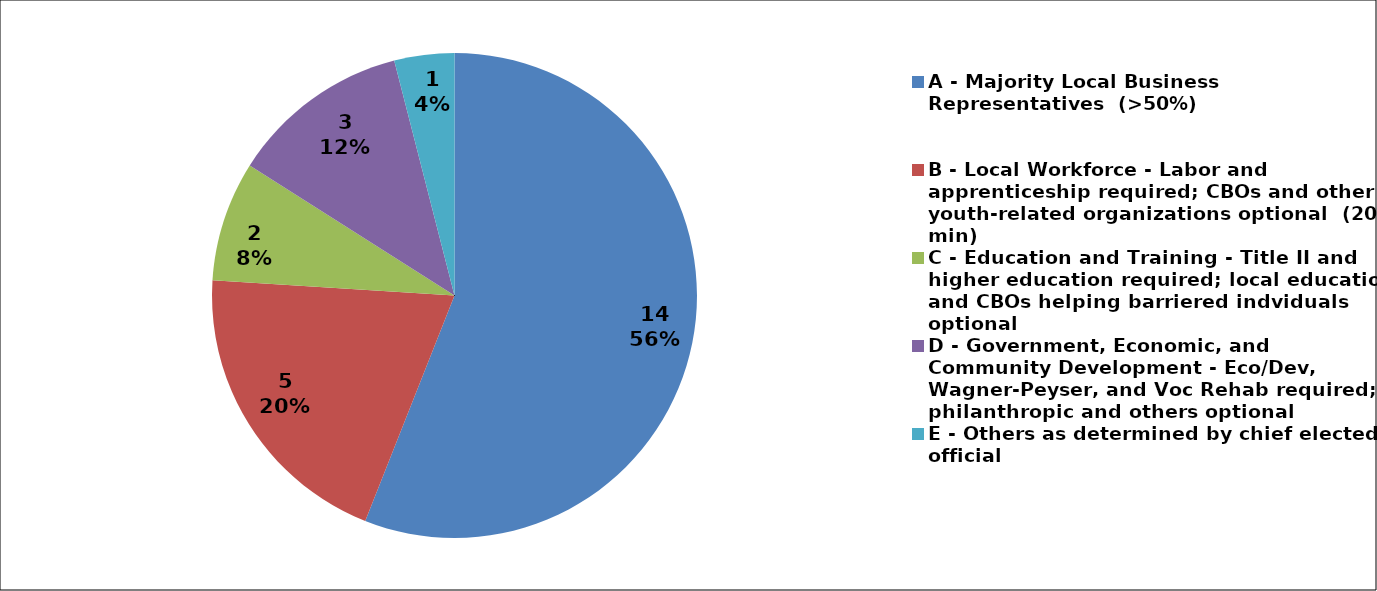
| Category | Series 0 |
|---|---|
| A - Majority Local Business Representatives  (>50%) | 14 |
| B - Local Workforce - Labor and apprenticeship required; CBOs and other youth-related organizations optional  (20% min) | 5 |
| C - Education and Training - Title II and higher education required; local education and CBOs helping barriered indviduals optional | 2 |
| D - Government, Economic, and Community Development - Eco/Dev, Wagner-Peyser, and Voc Rehab required; philanthropic and others optional | 3 |
| E - Others as determined by chief elected official | 1 |